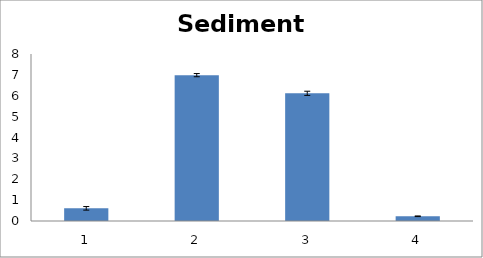
| Category | Series 0 |
|---|---|
| 0 | 0.607 |
| 1 | 6.987 |
| 2 | 6.117 |
| 3 | 0.227 |